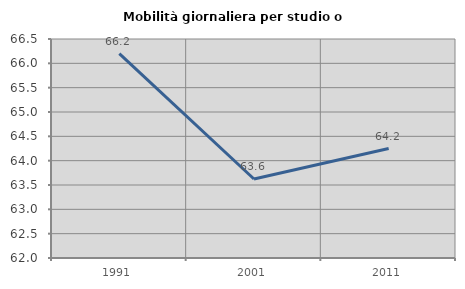
| Category | Mobilità giornaliera per studio o lavoro |
|---|---|
| 1991.0 | 66.199 |
| 2001.0 | 63.624 |
| 2011.0 | 64.249 |